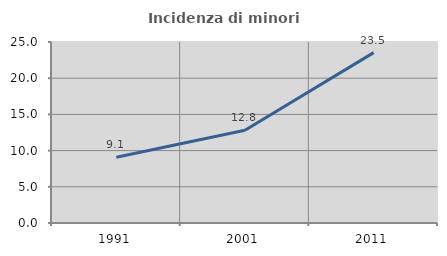
| Category | Incidenza di minori stranieri |
|---|---|
| 1991.0 | 9.091 |
| 2001.0 | 12.821 |
| 2011.0 | 23.529 |